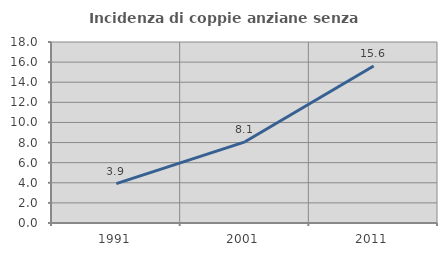
| Category | Incidenza di coppie anziane senza figli  |
|---|---|
| 1991.0 | 3.911 |
| 2001.0 | 8.075 |
| 2011.0 | 15.609 |